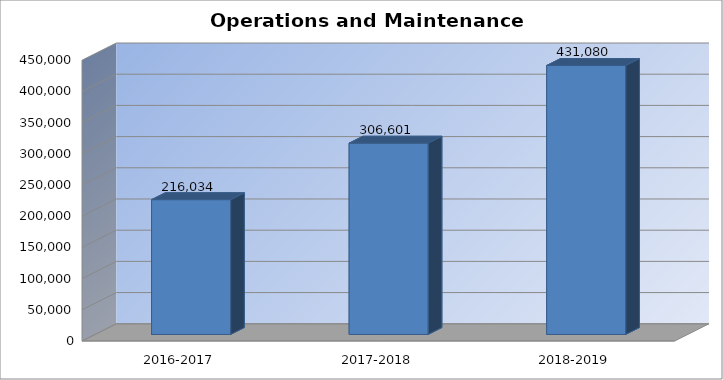
| Category | Operations and Maintenance Expenditures |
|---|---|
| 2016-2017 | 216034 |
| 2017-2018 | 306601 |
| 2018-2019 | 431080 |